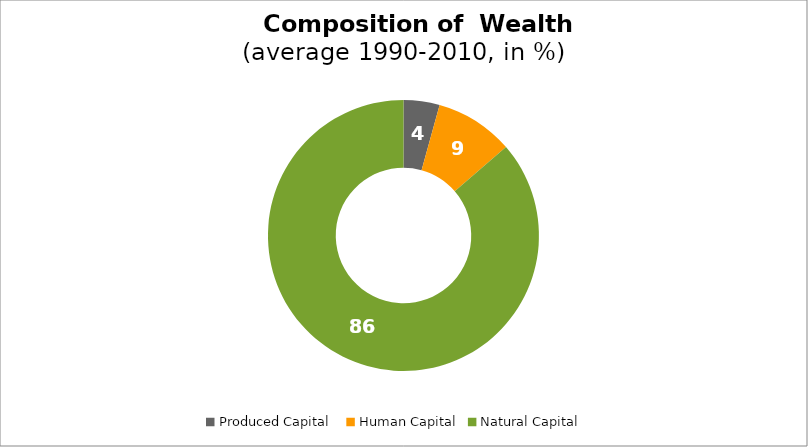
| Category | Series 0 |
|---|---|
| Produced Capital  | 4.295 |
| Human Capital | 9.359 |
| Natural Capital | 86.346 |